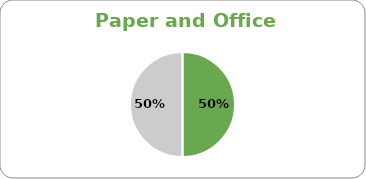
| Category | Series 0 |
|---|---|
| Sub-Total EPP | 3 |
| Sub-Total Non EPP | 3 |